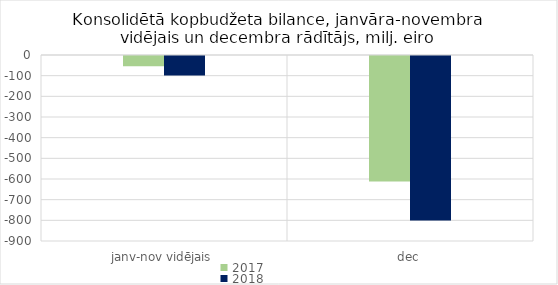
| Category | 2017 | 2018 |
|---|---|---|
| janv-nov vidējais | -49209.011 | -93800.107 |
| dec | -607594.717 | -796518.828 |